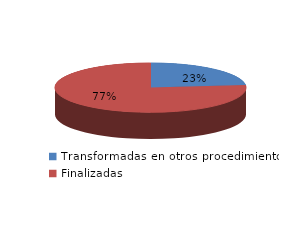
| Category | Series 0 |
|---|---|
| Transformadas en otros procedimientos | 3267 |
| Finalizadas | 10716 |